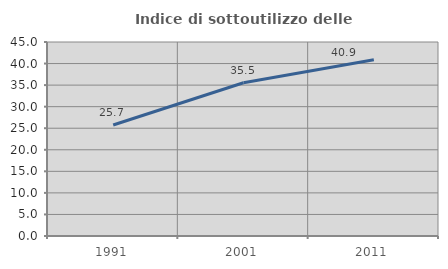
| Category | Indice di sottoutilizzo delle abitazioni  |
|---|---|
| 1991.0 | 25.738 |
| 2001.0 | 35.546 |
| 2011.0 | 40.896 |